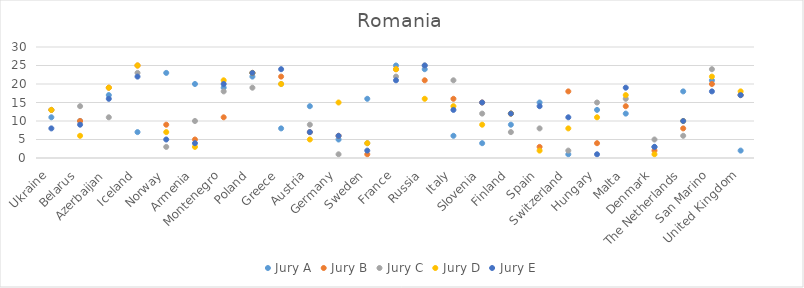
| Category | Jury A | Jury B | Jury C | Jury D | Jury E |
|---|---|---|---|---|---|
| Ukraine | 11 | 13 | 13 | 13 | 8 |
| Belarus | 10 | 10 | 14 | 6 | 9 |
| Azerbaijan | 17 | 19 | 11 | 19 | 16 |
| Iceland | 7 | 25 | 23 | 25 | 22 |
| Norway | 23 | 9 | 3 | 7 | 5 |
| Armenia | 20 | 5 | 10 | 3 | 4 |
| Montenegro | 19 | 11 | 18 | 21 | 20 |
| Poland | 22 | 23 | 19 | 23 | 23 |
| Greece | 8 | 22 | 20 | 20 | 24 |
| Austria | 14 | 7 | 9 | 5 | 7 |
| Germany | 5 | 6 | 1 | 15 | 6 |
| Sweden | 16 | 1 | 4 | 4 | 2 |
| France | 25 | 24 | 22 | 24 | 21 |
| Russia | 24 | 21 | 25 | 16 | 25 |
| Italy | 6 | 16 | 21 | 14 | 13 |
| Slovenia | 4 | 15 | 12 | 9 | 15 |
| Finland | 9 | 12 | 7 | 12 | 12 |
| Spain | 15 | 3 | 8 | 2 | 14 |
| Switzerland | 1 | 18 | 2 | 8 | 11 |
| Hungary | 13 | 4 | 15 | 11 | 1 |
| Malta | 12 | 14 | 16 | 17 | 19 |
| Denmark | 3 | 2 | 5 | 1 | 3 |
| The Netherlands | 18 | 8 | 6 | 10 | 10 |
| San Marino | 21 | 20 | 24 | 22 | 18 |
| United Kingdom | 2 | 17 | 17 | 18 | 17 |